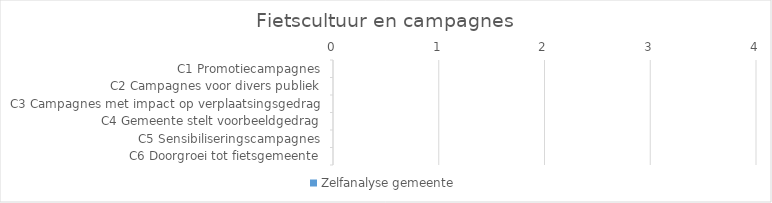
| Category | Zelfanalyse gemeente |
|---|---|
| C1 Promotiecampagnes | 0 |
| C2 Campagnes voor divers publiek | 0 |
| C3 Campagnes met impact op verplaatsingsgedrag | 0 |
| C4 Gemeente stelt voorbeeldgedrag | 0 |
| C5 Sensibiliseringscampagnes | 0 |
| C6 Doorgroei tot fietsgemeente | 0 |